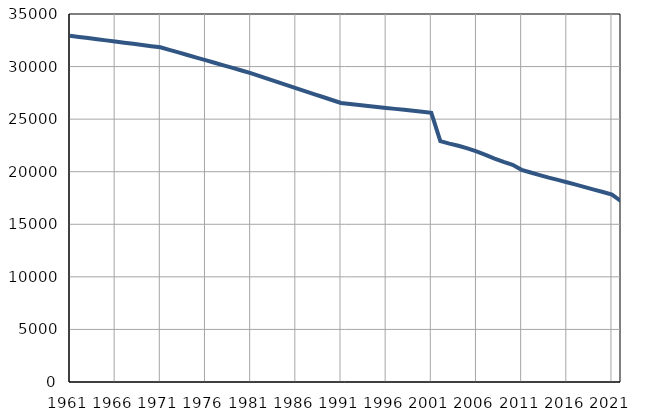
| Category | Population
size |
|---|---|
| 1961.0 | 32932 |
| 1962.0 | 32822 |
| 1963.0 | 32712 |
| 1964.0 | 32602 |
| 1965.0 | 32492 |
| 1966.0 | 32383 |
| 1967.0 | 32273 |
| 1968.0 | 32163 |
| 1969.0 | 32053 |
| 1970.0 | 31943 |
| 1971.0 | 31833 |
| 1972.0 | 31587 |
| 1973.0 | 31343 |
| 1974.0 | 31098 |
| 1975.0 | 30853 |
| 1976.0 | 30607 |
| 1977.0 | 30363 |
| 1978.0 | 30118 |
| 1979.0 | 29873 |
| 1980.0 | 29629 |
| 1981.0 | 29383 |
| 1982.0 | 29098 |
| 1983.0 | 28813 |
| 1984.0 | 28529 |
| 1985.0 | 28244 |
| 1986.0 | 27959 |
| 1987.0 | 27674 |
| 1988.0 | 27389 |
| 1989.0 | 27105 |
| 1990.0 | 26820 |
| 1991.0 | 26535 |
| 1992.0 | 26442 |
| 1993.0 | 26349 |
| 1994.0 | 26255 |
| 1995.0 | 26162 |
| 1996.0 | 26069 |
| 1997.0 | 25976 |
| 1998.0 | 25883 |
| 1999.0 | 25790 |
| 2000.0 | 25696 |
| 2001.0 | 25603 |
| 2002.0 | 22900 |
| 2003.0 | 22671 |
| 2004.0 | 22465 |
| 2005.0 | 22222 |
| 2006.0 | 21933 |
| 2007.0 | 21608 |
| 2008.0 | 21253 |
| 2009.0 | 20931 |
| 2010.0 | 20658 |
| 2011.0 | 20181 |
| 2012.0 | 19923 |
| 2013.0 | 19678 |
| 2014.0 | 19434 |
| 2015.0 | 19224 |
| 2016.0 | 18995 |
| 2017.0 | 18771 |
| 2018.0 | 18536 |
| 2019.0 | 18298 |
| 2020.0 | 18068 |
| 2021.0 | 17817 |
| 2022.0 | 17212 |